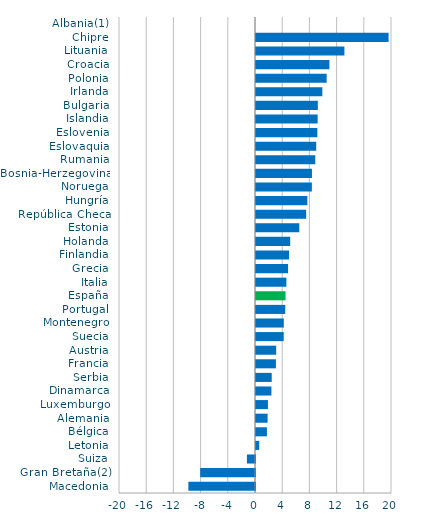
| Category | Series 0 |
|---|---|
| Macedonia | -9.797 |
| Gran Bretaña(2) | -8.06 |
| Suiza | -1.187 |
| Letonia | 0.475 |
| Bélgica | 1.605 |
| Alemania | 1.71 |
| Luxemburgo | 1.758 |
| Dinamarca | 2.268 |
| Serbia | 2.311 |
| Francia | 2.93 |
| Austria | 2.967 |
| Suecia | 4.074 |
| Montenegro | 4.089 |
| Portugal | 4.301 |
| España | 4.35 |
| Italia | 4.471 |
| Grecia | 4.718 |
| Finlandia | 4.864 |
| Holanda | 5.032 |
| Estonia | 6.366 |
| República Checa | 7.378 |
| Hungría | 7.549 |
| Noruega | 8.214 |
| Bosnia-Herzegovina | 8.227 |
| Rumania | 8.715 |
| Eslovaquia | 8.855 |
| Eslovenia | 9.025 |
| Islandia | 9.067 |
| Bulgaria | 9.092 |
| Irlanda | 9.757 |
| Polonia | 10.391 |
| Croacia | 10.794 |
| Lituania | 13 |
| Chipre | 19.495 |
| Albania(1) | 0 |